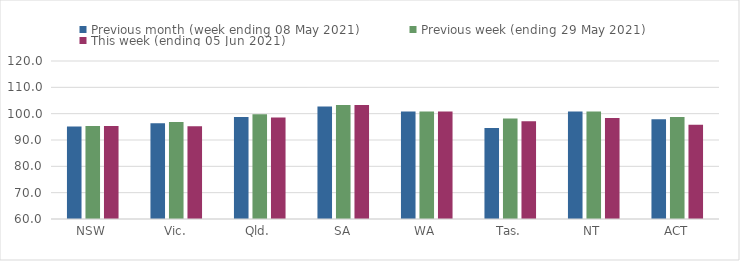
| Category | Previous month (week ending 08 May 2021) | Previous week (ending 29 May 2021) | This week (ending 05 Jun 2021) |
|---|---|---|---|
| NSW | 95.13 | 95.32 | 95.32 |
| Vic. | 96.39 | 96.79 | 95.25 |
| Qld. | 98.74 | 99.75 | 98.5 |
| SA | 102.73 | 103.32 | 103.32 |
| WA | 100.87 | 100.82 | 100.82 |
| Tas. | 94.57 | 98.12 | 97.09 |
| NT | 100.78 | 100.87 | 98.37 |
| ACT | 97.85 | 98.72 | 95.76 |